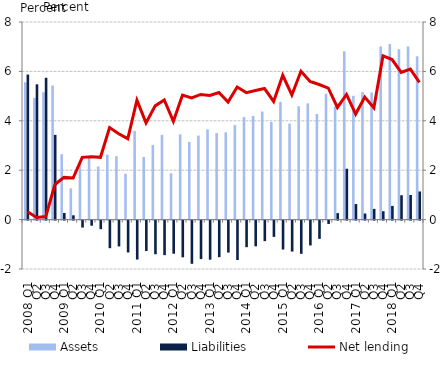
| Category | Assets | Liabilities |
|---|---|---|
| 2008 Q1 | 5.563 | 5.871 |
| Q2 | 4.928 | 5.477 |
| Q3 | 5.154 | 5.743 |
| Q4 | 5.427 | 3.431 |
| 2009 Q1 | 2.647 | 0.269 |
| Q2 | 1.264 | 0.175 |
| Q3 | 2.29 | -0.282 |
| Q4 | 2.503 | -0.207 |
| 2010 Q1 | 2.15 | -0.348 |
| Q2 | 2.631 | -1.117 |
| Q3 | 2.565 | -1.047 |
| Q4 | 1.855 | -1.291 |
| 2011 Q1 | 3.592 | -1.576 |
| Q2 | 2.534 | -1.232 |
| Q3 | 3.017 | -1.362 |
| Q4 | 3.433 | -1.398 |
| 2012 Q1 | 1.875 | -1.342 |
| Q2 | 3.455 | -1.487 |
| Q3 | 3.144 | -1.749 |
| Q4 | 3.401 | -1.558 |
| 2013 Q1 | 3.654 | -1.582 |
| Q2 | 3.503 | -1.479 |
| Q3 | 3.533 | -1.295 |
| Q4 | 3.826 | -1.594 |
| 2014 Q1 | 4.152 | -1.076 |
| Q2 | 4.199 | -1.042 |
| Q3 | 4.373 | -0.831 |
| Q4 | 3.953 | -0.659 |
| 2015 Q1 | 4.768 | -1.171 |
| Q2 | 3.888 | -1.254 |
| Q3 | 4.592 | -1.346 |
| Q4 | 4.706 | -1.006 |
| 2016 Q1 | 4.276 | -0.74 |
| Q2 | 5.098 | -0.136 |
| Q3 | 4.584 | 0.262 |
| Q4 | 6.816 | 2.06 |
| 2017 Q1 | 5.012 | 0.63 |
| Q2 | 5.162 | 0.247 |
| Q3 | 5.147 | 0.435 |
| Q4 | 7.011 | 0.339 |
| 2018 Q1 | 7.107 | 0.555 |
| Q2 | 6.901 | 0.986 |
| Q3 | 7.013 | 0.996 |
| Q4 | 6.61 | 1.14 |